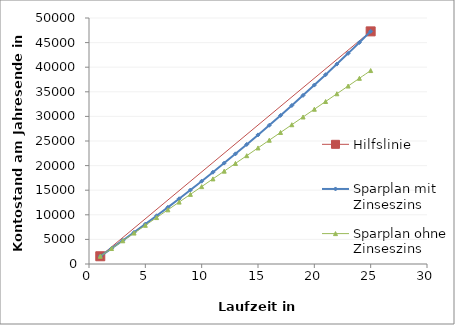
| Category | Hilfslinie |
|---|---|
| 1.0 | 1572.675 |
| 25.0 | 47279.366 |